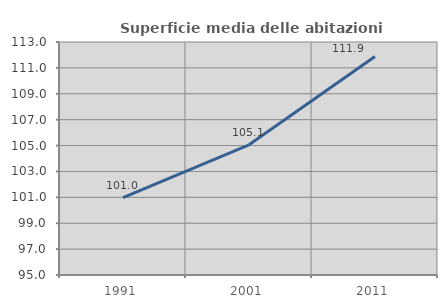
| Category | Superficie media delle abitazioni occupate |
|---|---|
| 1991.0 | 100.979 |
| 2001.0 | 105.061 |
| 2011.0 | 111.882 |